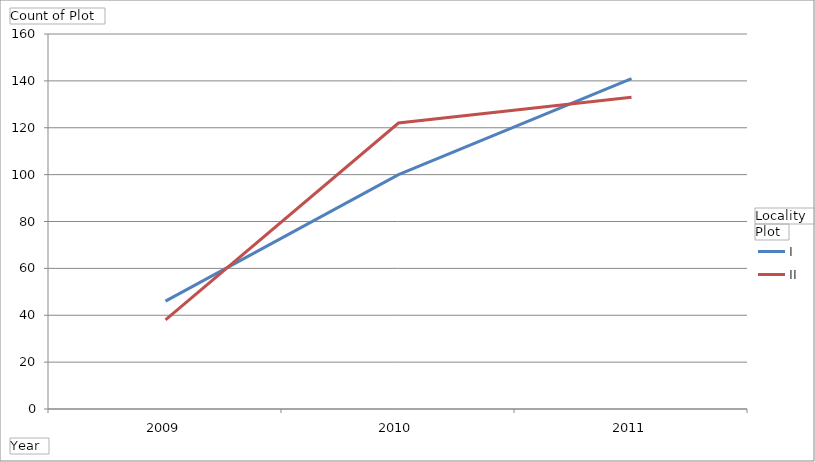
| Category | Boiling Springs - I | Boiling Springs - II |
|---|---|---|
| 2009 | 46 | 38 |
| 2010 | 100 | 122 |
| 2011 | 141 | 133 |